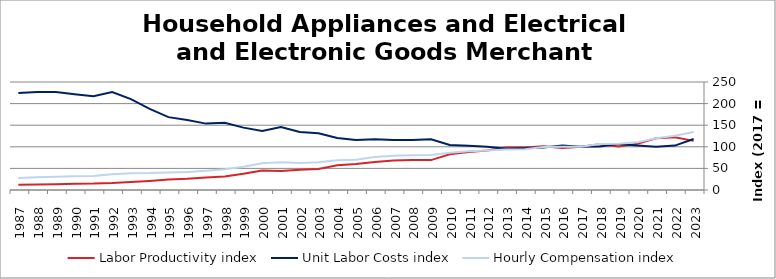
| Category | Labor Productivity index | Unit Labor Costs index | Hourly Compensation index |
|---|---|---|---|
| 2023.0 | 113.71 | 117.993 | 134.17 |
| 2022.0 | 122.138 | 102.824 | 125.587 |
| 2021.0 | 119.666 | 100.207 | 119.913 |
| 2020.0 | 107.151 | 102.905 | 110.263 |
| 2019.0 | 100.795 | 106.494 | 107.341 |
| 2018.0 | 105.842 | 100.433 | 106.301 |
| 2017.0 | 100 | 100 | 100 |
| 2016.0 | 96.947 | 103.277 | 100.125 |
| 2015.0 | 101.522 | 98.157 | 99.651 |
| 2014.0 | 98.112 | 96.41 | 94.589 |
| 2013.0 | 98.193 | 95.29 | 93.568 |
| 2012.0 | 91.64 | 99.867 | 91.518 |
| 2011.0 | 87.784 | 102.39 | 89.881 |
| 2010.0 | 82.66 | 104.02 | 85.984 |
| 2009.0 | 69.247 | 117.338 | 81.253 |
| 2008.0 | 69.506 | 115.824 | 80.504 |
| 2007.0 | 68.346 | 115.811 | 79.152 |
| 2006.0 | 64.88 | 117.598 | 76.298 |
| 2005.0 | 60.168 | 115.962 | 69.772 |
| 2004.0 | 57.174 | 120.507 | 68.899 |
| 2003.0 | 48.827 | 131.299 | 64.11 |
| 2002.0 | 46.598 | 134.185 | 62.528 |
| 2001.0 | 43.91 | 145.855 | 64.045 |
| 2000.0 | 45.264 | 136.381 | 61.731 |
| 1999.0 | 37.378 | 144.389 | 53.97 |
| 1998.0 | 31.013 | 155.498 | 48.224 |
| 1997.0 | 29.092 | 153.664 | 44.704 |
| 1996.0 | 25.766 | 161.91 | 41.718 |
| 1995.0 | 24.094 | 168.691 | 40.644 |
| 1994.0 | 20.901 | 187.827 | 39.257 |
| 1993.0 | 18.458 | 210.495 | 38.854 |
| 1992.0 | 16.125 | 226.983 | 36.6 |
| 1991.0 | 14.796 | 217.283 | 32.15 |
| 1990.0 | 14.479 | 221.809 | 32.115 |
| 1989.0 | 13.573 | 226.912 | 30.798 |
| 1988.0 | 12.883 | 227.112 | 29.259 |
| 1987.0 | 12.299 | 224.673 | 27.632 |